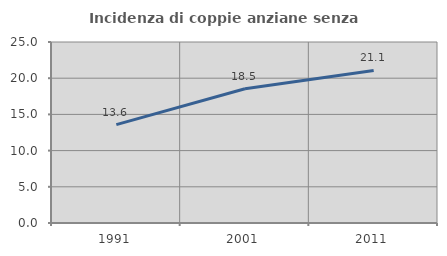
| Category | Incidenza di coppie anziane senza figli  |
|---|---|
| 1991.0 | 13.589 |
| 2001.0 | 18.545 |
| 2011.0 | 21.074 |